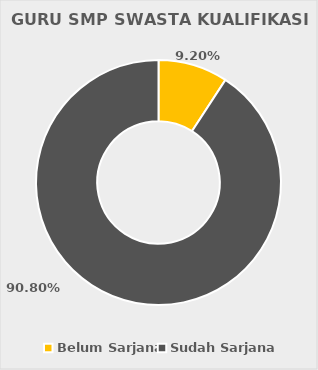
| Category | GURU SMP SWASTA KUALIFIKASI S1 |
|---|---|
| Belum Sarjana | 38 |
| Sudah Sarjana | 375 |